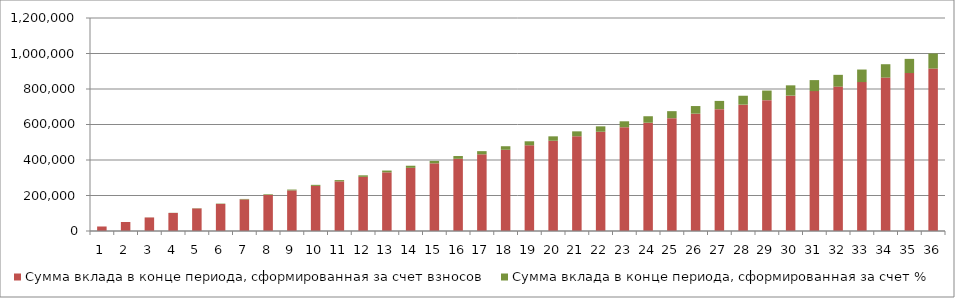
| Category | Сумма вклада в конце периода, сформированная за счет взносов | Сумма вклада в конце периода, сформированная за счет % |
|---|---|---|
| 0 | 25421.937 | 0 |
| 1 | 50843.875 | 127.11 |
| 2 | 76265.812 | 381.965 |
| 3 | 101687.75 | 765.203 |
| 4 | 127109.687 | 1277.468 |
| 5 | 152531.625 | 1919.404 |
| 6 | 177953.562 | 2691.659 |
| 7 | 203375.5 | 3594.885 |
| 8 | 228797.437 | 4629.737 |
| 9 | 254219.375 | 5796.873 |
| 10 | 279641.312 | 7096.954 |
| 11 | 305063.249 | 8530.646 |
| 12 | 330485.187 | 10098.615 |
| 13 | 355907.124 | 11801.534 |
| 14 | 381329.062 | 13640.077 |
| 15 | 406750.999 | 15614.923 |
| 16 | 432172.937 | 17726.753 |
| 17 | 457594.874 | 19976.251 |
| 18 | 483016.812 | 22364.107 |
| 19 | 508438.749 | 24891.011 |
| 20 | 533860.686 | 27557.66 |
| 21 | 559282.624 | 30364.752 |
| 22 | 584704.561 | 33312.989 |
| 23 | 610126.499 | 36403.077 |
| 24 | 635548.436 | 39635.724 |
| 25 | 660970.374 | 43011.645 |
| 26 | 686392.311 | 46531.555 |
| 27 | 711814.249 | 50196.175 |
| 28 | 737236.186 | 54006.227 |
| 29 | 762658.124 | 57962.439 |
| 30 | 788080.061 | 62065.542 |
| 31 | 813501.998 | 66316.27 |
| 32 | 838923.936 | 70715.361 |
| 33 | 864345.873 | 75263.558 |
| 34 | 889767.811 | 79961.605 |
| 35 | 915189.748 | 84810.252 |